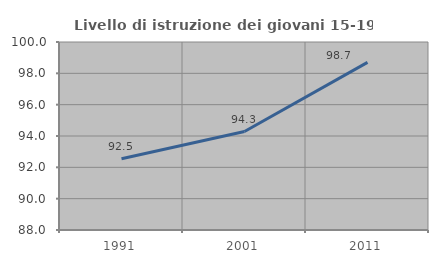
| Category | Livello di istruzione dei giovani 15-19 anni |
|---|---|
| 1991.0 | 92.542 |
| 2001.0 | 94.286 |
| 2011.0 | 98.701 |